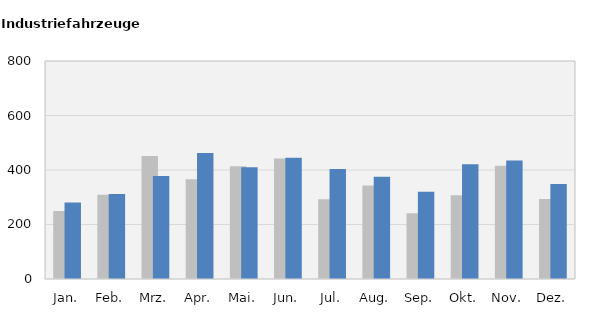
| Category | 2017 | 2018 |
|---|---|---|
| Jan. | 250 | 281 |
| Feb. | 309 | 312 |
| Mrz. | 451 | 378 |
| Apr. | 366 | 462 |
| Mai. | 414 | 410 |
| Jun. | 442 | 445 |
| Jul. | 293 | 404 |
| Aug. | 343 | 375 |
| Sep. | 241 | 320 |
| Okt. | 307 | 421 |
| Nov. | 416 | 435 |
| Dez. | 294 | 349 |